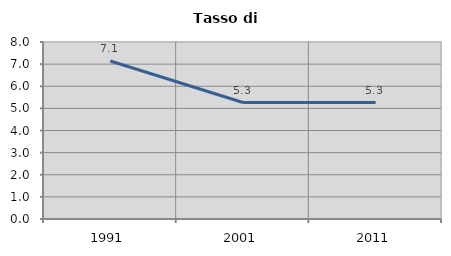
| Category | Tasso di disoccupazione   |
|---|---|
| 1991.0 | 7.143 |
| 2001.0 | 5.263 |
| 2011.0 | 5.263 |